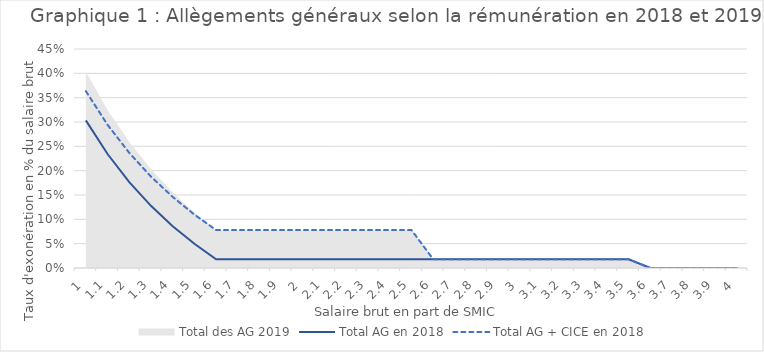
| Category | Total AG en 2018 | Total AG + CICE en 2018 |
|---|---|---|
| 1.0 | 0.303 | 0.363 |
| 1.1 | 0.234 | 0.294 |
| 1.2 | 0.177 | 0.237 |
| 1.3 | 0.128 | 0.188 |
| 1.4 | 0.086 | 0.146 |
| 1.5 | 0.05 | 0.11 |
| 1.6 | 0.018 | 0.078 |
| 1.7 | 0.018 | 0.078 |
| 1.8 | 0.018 | 0.078 |
| 1.9 | 0.018 | 0.078 |
| 2.0 | 0.018 | 0.078 |
| 2.1 | 0.018 | 0.078 |
| 2.2 | 0.018 | 0.078 |
| 2.3 | 0.018 | 0.078 |
| 2.4 | 0.018 | 0.078 |
| 2.5 | 0.018 | 0.078 |
| 2.6 | 0.018 | 0.018 |
| 2.7 | 0.018 | 0.018 |
| 2.8 | 0.018 | 0.018 |
| 2.9 | 0.018 | 0.018 |
| 3.0 | 0.018 | 0.018 |
| 3.1 | 0.018 | 0.018 |
| 3.2 | 0.018 | 0.018 |
| 3.3 | 0.018 | 0.018 |
| 3.4 | 0.018 | 0.018 |
| 3.5 | 0.018 | 0.018 |
| 3.6 | 0 | 0 |
| 3.7 | 0 | 0 |
| 3.8 | 0 | 0 |
| 3.9 | 0 | 0 |
| 4.0 | 0 | 0 |